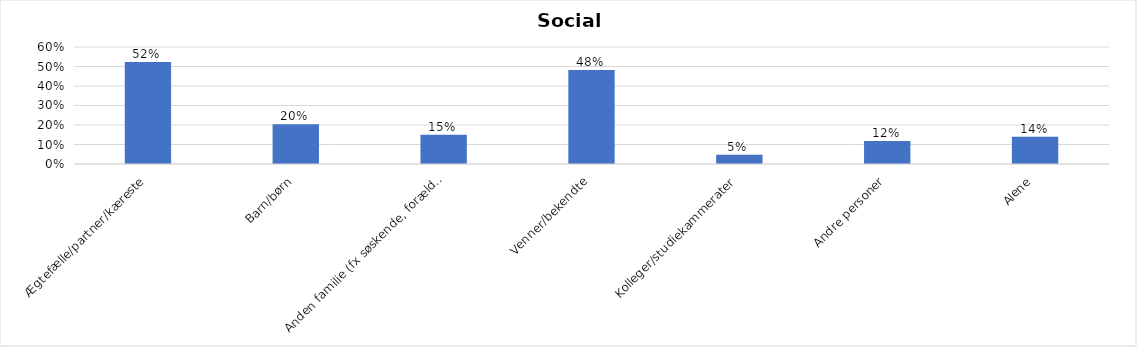
| Category | % |
|---|---|
| Ægtefælle/partner/kæreste | 0.523 |
| Barn/børn | 0.203 |
| Anden familie (fx søskende, forældre) | 0.15 |
| Venner/bekendte | 0.482 |
| Kolleger/studiekammerater | 0.047 |
| Andre personer | 0.118 |
| Alene | 0.139 |